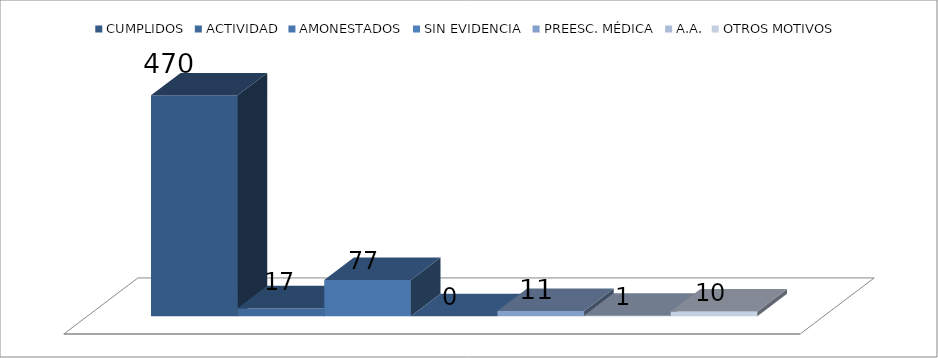
| Category | CUMPLIDOS | ACTIVIDAD | AMONESTADOS | SIN EVIDENCIA | PREESC. MÉDICA | A.A. | OTROS MOTIVOS |
|---|---|---|---|---|---|---|---|
|  | 470 | 17 | 77 | 0 | 11 | 1 | 10 |